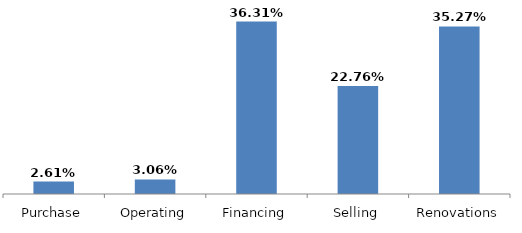
| Category | Series 0 |
|---|---|
| Purchase | 0.026 |
| Operating | 0.031 |
| Financing | 0.363 |
| Selling | 0.228 |
| Renovations | 0.353 |